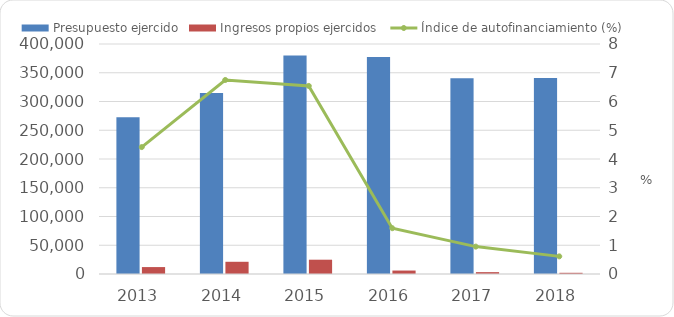
| Category | Presupuesto ejercido | Ingresos propios ejercidos  |
|---|---|---|
| 2013 | 272702.822 | 12037.736 |
| 2014 | 314864.8 | 21248.3 |
| 2015 | 380021.6 | 24861.4 |
| 2016 | 377416.6 | 6012.7 |
| 2017 | 340334.7 | 3242.2 |
| 2018 | 340765 | 2090 |